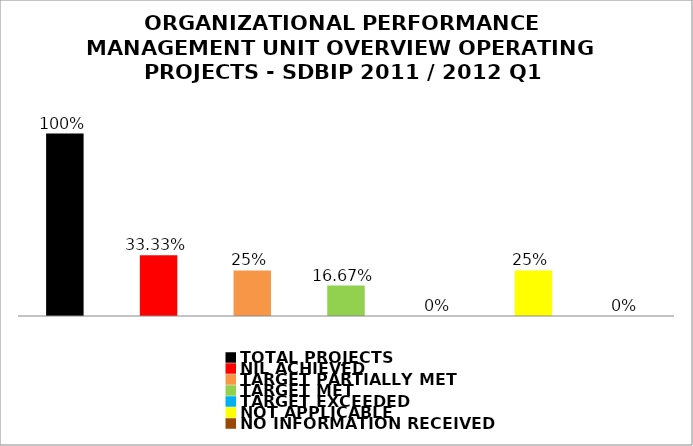
| Category | Series 0 |
|---|---|
| TOTAL PROJECTS | 1 |
| NIL ACHIEVED | 0.333 |
| TARGET PARTIALLY MET | 0.25 |
| TARGET MET | 0.167 |
| TARGET EXCEEDED | 0 |
| NOT APPLICABLE | 0.25 |
| NO INFORMATION RECEIVED | 0 |